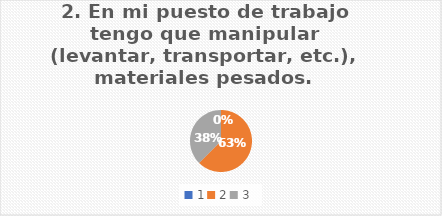
| Category | En mi puesto de trabajo tengo que manipular (levantar, transportar, etc.), materiales pesados. |
|---|---|
| 0 | 0 |
| 1 | 62.5 |
| 2 | 37.5 |